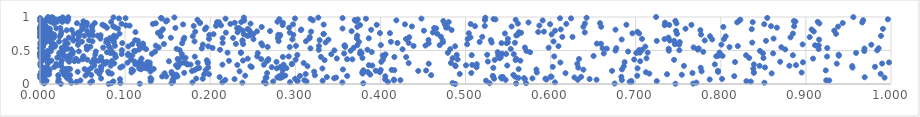
| Category | Series 0 |
|---|---|
| 0.4878804328560919 | 0.001 |
| 0.08073276438475993 | 0.002 |
| 0.024520375107620094 | 0.003 |
| 0.7467008120944755 | 0.004 |
| 0.11722900925854397 | 0.005 |
| 0.7674508384992096 | 0.006 |
| 0.6752529157554011 | 0.007 |
| 0.5594815407477001 | 0.008 |
| 0.26535349641097333 | 0.009 |
| 0.0048573380146806 | 0.01 |
| 0.3798312647377141 | 0.011 |
| 0.5282504182690033 | 0.012 |
| 0.5710814944261364 | 0.013 |
| 0.1545440385110519 | 0.014 |
| 0.4847732465467382 | 0.015 |
| 0.09444998300492234 | 0.016 |
| 0.08430114236085229 | 0.017 |
| 0.036811685665113475 | 0.018 |
| 0.8512460286920177 | 0.019 |
| 0.2378339751289925 | 0.02 |
| 0.7713538472379778 | 0.021 |
| 0.05912770461205603 | 0.022 |
| 0.17915505057889586 | 0.023 |
| 0.35533967566173225 | 0.024 |
| 0.6051288666323837 | 0.025 |
| 0.2142898749234011 | 0.026 |
| 0.29379831785421984 | 0.027 |
| 0.04321681422853025 | 0.028 |
| 0.2632830154315957 | 0.029 |
| 0.6950162819520104 | 0.03 |
| 0.04252047385372695 | 0.031 |
| 0.408837892637597 | 0.032 |
| 0.15646761964706865 | 0.033 |
| 0.6929178064437032 | 0.034 |
| 0.021331097201373203 | 0.035 |
| 0.8352700135851566 | 0.036 |
| 0.27395963208172985 | 0.037 |
| 0.3131909570694208 | 0.038 |
| 0.0862679016053936 | 0.039 |
| 0.13006355874069642 | 0.04 |
| 0.06121465551839461 | 0.041 |
| 0.8300943755709171 | 0.042 |
| 0.7247593880904459 | 0.043 |
| 0.30277974974433997 | 0.044 |
| 0.6948438279920354 | 0.045 |
| 0.004846995073066436 | 0.046 |
| 0.002621998886583417 | 0.047 |
| 0.3321628173878455 | 0.048 |
| 0.007754410727365538 | 0.049 |
| 0.5241294558206092 | 0.05 |
| 0.30195034415186683 | 0.051 |
| 0.0475264572983196 | 0.052 |
| 0.9274225627654002 | 0.053 |
| 0.005246357618146515 | 0.054 |
| 0.923861116569446 | 0.055 |
| 0.41596131428528604 | 0.056 |
| 0.31066149178171576 | 0.057 |
| 0.42348944540144506 | 0.058 |
| 0.6837534770686954 | 0.059 |
| 0.2176902512317171 | 0.06 |
| 0.03531344083209514 | 0.061 |
| 0.5471715728297489 | 0.062 |
| 0.6318762884274811 | 0.063 |
| 0.6539835170438418 | 0.064 |
| 0.15581519196866533 | 0.065 |
| 0.41582412523667245 | 0.066 |
| 0.5951834823529623 | 0.067 |
| 0.7869445026714389 | 0.068 |
| 0.40556056278413455 | 0.069 |
| 0.021906806795813222 | 0.07 |
| 0.1308218660485312 | 0.071 |
| 0.09397625475961295 | 0.072 |
| 0.22858739168592213 | 0.073 |
| 0.6458336717661135 | 0.074 |
| 0.5696911116029518 | 0.075 |
| 0.801482969613891 | 0.076 |
| 0.2997780643649713 | 0.077 |
| 0.19124046132683284 | 0.078 |
| 0.5336783961020007 | 0.079 |
| 0.5938597631287493 | 0.08 |
| 0.18356985160824893 | 0.081 |
| 0.5425075949592462 | 0.082 |
| 0.0717589911108597 | 0.083 |
| 0.5786409435452181 | 0.084 |
| 0.03216989785236622 | 0.085 |
| 0.3456796125363326 | 0.086 |
| 0.004840499050670466 | 0.087 |
| 0.5687619323102657 | 0.088 |
| 0.12978879707066976 | 0.089 |
| 0.2821670857440957 | 0.09 |
| 0.5620448655483232 | 0.091 |
| 0.265121880395184 | 0.092 |
| 0.00030277909072847403 | 0.093 |
| 0.2661861278499025 | 0.094 |
| 0.9924260365230058 | 0.095 |
| 0.3479821517756158 | 0.096 |
| 0.2788835404045434 | 0.097 |
| 0.6280132604290736 | 0.098 |
| 0.15837850628349803 | 0.099 |
| 0.5416673492873828 | 0.1 |
| 0.9690911224303287 | 0.101 |
| 0.28461401306692014 | 0.102 |
| 0.21112004652552252 | 0.103 |
| 0.33712095253899255 | 0.104 |
| 0.5439042644155626 | 0.105 |
| 0.6358284704066399 | 0.106 |
| 0.6831056416891739 | 0.107 |
| 0.6010519534140378 | 0.108 |
| 0.5583172252398778 | 0.109 |
| 0.6000127133095245 | 0.11 |
| 0.030590012816468386 | 0.111 |
| 0.14350465966794046 | 0.112 |
| 0.14842499886392138 | 0.113 |
| 0.1615426772578559 | 0.114 |
| 0.4057419509527594 | 0.115 |
| 0.28107096918776225 | 0.116 |
| 0.8158081772318846 | 0.117 |
| 0.5320411307256602 | 0.118 |
| 0.5323029949697392 | 0.119 |
| 0.3609641415388879 | 0.12 |
| 0.3055255005623854 | 0.121 |
| 0.006190611727082751 | 0.122 |
| 0.7018220829344053 | 0.123 |
| 0.24112139580812222 | 0.124 |
| 0.28820350021640295 | 0.125 |
| 0.05344917973416546 | 0.126 |
| 0.021603478124332588 | 0.127 |
| 0.0038223193811913058 | 0.128 |
| 0.00011299589376260692 | 0.129 |
| 0.02165129956009599 | 0.13 |
| 0.32303833684376726 | 0.131 |
| 0.45961917530682905 | 0.132 |
| 0.035412558361656264 | 0.133 |
| 0.06025116996658135 | 0.134 |
| 0.028532805774107068 | 0.135 |
| 0.5562409851575227 | 0.136 |
| 0.03221260247255145 | 0.137 |
| 0.754171800029363 | 0.138 |
| 0.00028714745434983084 | 0.139 |
| 0.1601450164175241 | 0.14 |
| 0.3880447917893416 | 0.141 |
| 0.010461693811720348 | 0.142 |
| 0.15588207477882193 | 0.143 |
| 0.003866084557679074 | 0.144 |
| 0.19283268731312433 | 0.145 |
| 0.7368077459962049 | 0.146 |
| 0.1985219693769392 | 0.147 |
| 0.2845539263029129 | 0.148 |
| 0.31221119297812255 | 0.149 |
| 0.4932635524502053 | 0.15 |
| 0.15534027847904738 | 0.151 |
| 0.9878257115096399 | 0.152 |
| 0.06971242871858695 | 0.153 |
| 0.08427142269704545 | 0.154 |
| 0.7160306101816701 | 0.155 |
| 0.3791022231225504 | 0.156 |
| 0.010228295964154272 | 0.157 |
| 0.8597426806381263 | 0.158 |
| 0.08118080807724261 | 0.159 |
| 0.14643736549496864 | 0.16 |
| 0.0032485407082466105 | 0.161 |
| 0.6175242453698286 | 0.162 |
| 0.2668742404216115 | 0.163 |
| 0.7667362577841988 | 0.164 |
| 0.5068025896575381 | 0.165 |
| 0.16944314847175573 | 0.166 |
| 0.0014290285657170298 | 0.167 |
| 0.05613651024632576 | 0.168 |
| 0.8388024418286827 | 0.169 |
| 0.8388497628330305 | 0.17 |
| 0.8949966076110618 | 0.171 |
| 0.5837864187066505 | 0.172 |
| 0.10749488751549689 | 0.173 |
| 0.378747323590484 | 0.174 |
| 0.004968766565573148 | 0.175 |
| 0.7119998873608324 | 0.176 |
| 0.3993585375321774 | 0.177 |
| 0.3852362630945356 | 0.178 |
| 0.15451569695854853 | 0.179 |
| 0.0014051420144248145 | 0.18 |
| 0.7967709519512499 | 0.181 |
| 0.044292480474079396 | 0.182 |
| 0.08009454783731007 | 0.183 |
| 0.00416016006646077 | 0.184 |
| 0.32211648286613465 | 0.185 |
| 0.010093721588487018 | 0.186 |
| 0.12984456984227402 | 0.187 |
| 0.3799310684924371 | 0.188 |
| 0.23451202038094537 | 0.189 |
| 0.7774495767478907 | 0.19 |
| 0.03108776077824677 | 0.191 |
| 0.06673229532734547 | 0.192 |
| 0.025991859205976284 | 0.193 |
| 0.17865473370587664 | 0.194 |
| 0.4444652216454424 | 0.195 |
| 0.6722009209051087 | 0.196 |
| 0.7966311860419103 | 0.197 |
| 0.39453371945009214 | 0.198 |
| 0.10957742556004342 | 0.199 |
| 0.071660261609627 | 0.2 |
| 0.45372156255193985 | 0.201 |
| 0.007284409817682827 | 0.202 |
| 0.9233439685878334 | 0.203 |
| 0.05644698423010802 | 0.204 |
| 0.3800227030086945 | 0.205 |
| 0.4164013454608789 | 0.206 |
| 0.19476915696729877 | 0.207 |
| 0.18156926764302353 | 0.208 |
| 0.28512100290619113 | 0.209 |
| 0.4004152312715871 | 0.21 |
| 0.4132256294324792 | 0.211 |
| 0.006211528615259479 | 0.212 |
| 0.005769867269270539 | 0.213 |
| 0.6385198957260038 | 0.214 |
| 0.011363778519053775 | 0.215 |
| 0.5833126981603439 | 0.216 |
| 0.35597461128823804 | 0.217 |
| 0.10769006445381778 | 0.218 |
| 0.6838799373254867 | 0.219 |
| 0.11882388542556604 | 0.22 |
| 0.13036381499371152 | 0.221 |
| 0.5624255369437771 | 0.222 |
| 0.05240727362098151 | 0.223 |
| 0.03527272625182964 | 0.224 |
| 0.1336462519848244 | 0.225 |
| 0.029767215886949503 | 0.226 |
| 0.03293518352890177 | 0.227 |
| 0.8381903989306807 | 0.228 |
| 0.18447936203957 | 0.229 |
| 0.12648962842428282 | 0.23 |
| 0.11655727256470541 | 0.231 |
| 0.33184463610818143 | 0.232 |
| 0.278239701719051 | 0.233 |
| 0.7021852303944293 | 0.234 |
| 0.059757354755039765 | 0.235 |
| 0.28960631321788205 | 0.236 |
| 0.0073229221389360935 | 0.237 |
| 0.12367115615976107 | 0.238 |
| 0.1870701765533602 | 0.239 |
| 0.07206025493486137 | 0.24 |
| 0.5326741199477586 | 0.241 |
| 0.7763954991317129 | 0.242 |
| 0.004801943345752876 | 0.243 |
| 0.6325120210121195 | 0.244 |
| 0.9547407891912948 | 0.245 |
| 0.09430132222157811 | 0.246 |
| 0.8519835129022563 | 0.247 |
| 0.19752033740732694 | 0.248 |
| 0.008640550065387893 | 0.249 |
| 0.5130037025259591 | 0.25 |
| 0.2723596399670112 | 0.251 |
| 0.16187908172722534 | 0.252 |
| 0.24877306919053543 | 0.253 |
| 0.016745185108791576 | 0.254 |
| 0.28233776433446667 | 0.255 |
| 0.6025260822936507 | 0.256 |
| 0.9811941835988178 | 0.257 |
| 0.0717364165851485 | 0.258 |
| 0.1618184920378862 | 0.259 |
| 0.11689116637345798 | 0.26 |
| 0.0010796117281438758 | 0.261 |
| 0.12487039257800384 | 0.262 |
| 0.09699971444412757 | 0.263 |
| 0.685993527501567 | 0.264 |
| 0.247255177119921 | 0.265 |
| 0.31430550055483264 | 0.266 |
| 0.48840041625442016 | 0.267 |
| 0.9544199155192055 | 0.268 |
| 0.024800576578820194 | 0.269 |
| 0.7566935407155277 | 0.27 |
| 0.8455029676268639 | 0.271 |
| 0.8805838022368809 | 0.272 |
| 0.08315581031238858 | 0.273 |
| 0.06381965518106965 | 0.274 |
| 0.3904826165721522 | 0.275 |
| 0.5490579299287539 | 0.276 |
| 0.4878232606534316 | 0.277 |
| 0.02036986213105455 | 0.278 |
| 0.5005746037642264 | 0.279 |
| 0.15986251021951017 | 0.28 |
| 0.3863996349930694 | 0.281 |
| 0.88841175047036 | 0.282 |
| 0.12891474629260508 | 0.283 |
| 0.23187875324346585 | 0.284 |
| 0.5078867484265639 | 0.285 |
| 0.00039206310688901083 | 0.286 |
| 0.2630546266447184 | 0.287 |
| 0.2862483399946667 | 0.288 |
| 0.21442490038701592 | 0.289 |
| 0.17692788528550152 | 0.29 |
| 0.17324285966814584 | 0.291 |
| 0.8388818286957135 | 0.292 |
| 0.7929511553334957 | 0.293 |
| 0.11201468798171484 | 0.294 |
| 0.5132745513252703 | 0.295 |
| 0.12068764813139325 | 0.296 |
| 0.2959516020633027 | 0.297 |
| 0.295952758340534 | 0.298 |
| 0.11558791722316475 | 0.299 |
| 0.01924900568183209 | 0.3 |
| 0.631354550919093 | 0.301 |
| 0.07648734417091542 | 0.302 |
| 0.456794812733079 | 0.303 |
| 0.936275713653441 | 0.304 |
| 0.989516137568601 | 0.305 |
| 0.16513957277058972 | 0.306 |
| 0.1720532785187269 | 0.307 |
| 0.08725939954992179 | 0.308 |
| 0.19703707036673246 | 0.309 |
| 0.024699237607075358 | 0.31 |
| 0.009206326219048487 | 0.311 |
| 0.4331974707807495 | 0.312 |
| 0.30987176318156645 | 0.313 |
| 0.4828387691123025 | 0.314 |
| 0.0006164706113904147 | 0.315 |
| 0.009432398059984056 | 0.316 |
| 0.10277117970582839 | 0.317 |
| 0.18535163965413745 | 0.318 |
| 0.1693282270465833 | 0.319 |
| 0.12895291597925018 | 0.32 |
| 0.6114743493023317 | 0.321 |
| 0.9976625430323695 | 0.322 |
| 0.06073991085714375 | 0.323 |
| 0.8965418151652575 | 0.324 |
| 0.12617789654068326 | 0.325 |
| 0.6869499682369447 | 0.326 |
| 0.19710900306605444 | 0.327 |
| 0.8167243831953318 | 0.328 |
| 0.07854927865583539 | 0.329 |
| 0.27789638334602296 | 0.33 |
| 0.4010562000259594 | 0.331 |
| 0.8698004617055751 | 0.332 |
| 0.03434817544324661 | 0.333 |
| 0.06435287961172466 | 0.334 |
| 0.5262322201733166 | 0.335 |
| 0.11109284093051447 | 0.336 |
| 0.2662786428825454 | 0.337 |
| 0.11749995737943608 | 0.338 |
| 0.15150252512682053 | 0.339 |
| 0.7053002547855568 | 0.34 |
| 0.040452703843514806 | 0.341 |
| 0.08430306228396622 | 0.342 |
| 0.0019007140563722846 | 0.343 |
| 0.07310545619634991 | 0.344 |
| 0.045099911874654 | 0.345 |
| 0.2220483023531025 | 0.346 |
| 0.06848988340176053 | 0.347 |
| 0.5645303740594104 | 0.348 |
| 0.013474003691693524 | 0.349 |
| 0.23856952775584955 | 0.35 |
| 0.025626557597972416 | 0.351 |
| 0.1627867163359205 | 0.352 |
| 0.009381549058196777 | 0.353 |
| 0.19606501107551233 | 0.354 |
| 0.2679305820518253 | 0.355 |
| 0.33439283066677267 | 0.356 |
| 0.5588290760652986 | 0.357 |
| 0.4027350165584904 | 0.358 |
| 0.534323876211148 | 0.359 |
| 0.0039172541118051435 | 0.36 |
| 0.7450711132193488 | 0.361 |
| 0.3003324744753328 | 0.362 |
| 0.05560099849194661 | 0.363 |
| 0.10696853276879185 | 0.364 |
| 0.03213514733392152 | 0.365 |
| 0.6981941443317247 | 0.366 |
| 0.49074175677678045 | 0.367 |
| 0.367052743308582 | 0.368 |
| 0.050251738940518514 | 0.369 |
| 0.3608638192510022 | 0.37 |
| 0.2600430841800198 | 0.371 |
| 0.26831337022341784 | 0.372 |
| 0.6333806335865365 | 0.373 |
| 0.06357652486058897 | 0.374 |
| 0.16169450244565126 | 0.375 |
| 0.5596676786614692 | 0.376 |
| 0.04227436361713509 | 0.377 |
| 0.24411703052452677 | 0.378 |
| 0.9084175652977917 | 0.379 |
| 0.11931100352704241 | 0.38 |
| 0.3488005029415835 | 0.381 |
| 0.0022570105534178387 | 0.382 |
| 0.7126748030478972 | 0.383 |
| 0.5401078838121054 | 0.384 |
| 0.48483687308101364 | 0.385 |
| 0.00212117494182966 | 0.386 |
| 0.8501495510373496 | 0.387 |
| 0.378889869516439 | 0.388 |
| 0.8333246017222306 | 0.389 |
| 0.001831437335832565 | 0.39 |
| 0.17106609380518625 | 0.391 |
| 0.05042434559835938 | 0.392 |
| 0.0004564766121756528 | 0.393 |
| 0.02026165646936537 | 0.394 |
| 0.005231301876030991 | 0.395 |
| 0.03567338724560051 | 0.396 |
| 0.16692305412570854 | 0.397 |
| 0.02162863038965665 | 0.398 |
| 0.5413750099484894 | 0.399 |
| 0.08898384897853658 | 0.4 |
| 0.07169828132175153 | 0.401 |
| 0.43028786247414147 | 0.402 |
| 0.4164080056394454 | 0.403 |
| 0.28538917307318934 | 0.404 |
| 0.33006845183676176 | 0.405 |
| 0.08869569646817746 | 0.406 |
| 0.4041208329824084 | 0.407 |
| 0.18190941362371318 | 0.408 |
| 0.03237277376619827 | 0.409 |
| 0.9248613575065089 | 0.41 |
| 0.29232044457187106 | 0.411 |
| 0.6042796171997077 | 0.412 |
| 0.25525140062431234 | 0.413 |
| 0.7946649772801395 | 0.414 |
| 0.05102084389973329 | 0.415 |
| 0.029333355324263545 | 0.416 |
| 0.5407643295131769 | 0.417 |
| 0.65047099883111 | 0.418 |
| 0.009339032555556164 | 0.419 |
| 0.8020435395127543 | 0.42 |
| 0.7969614054968295 | 0.421 |
| 0.9387033721263182 | 0.422 |
| 0.00014363689763233052 | 0.423 |
| 0.5384505617879908 | 0.424 |
| 0.4027004763623378 | 0.425 |
| 0.1085129525514328 | 0.426 |
| 0.10369551714385747 | 0.427 |
| 0.00821874739300025 | 0.428 |
| 0.8296831758417136 | 0.429 |
| 0.8847159404322933 | 0.43 |
| 0.5073123601049268 | 0.431 |
| 0.0005329192496341822 | 0.432 |
| 0.30238574877932034 | 0.433 |
| 0.026424466226492294 | 0.434 |
| 0.489741830451479 | 0.435 |
| 0.525485733103235 | 0.436 |
| 0.0007382716888134016 | 0.437 |
| 0.938480974057113 | 0.438 |
| 0.035588563190583705 | 0.439 |
| 0.08797312402383575 | 0.44 |
| 0.06498635957968327 | 0.441 |
| 0.4060001591295447 | 0.442 |
| 0.799259219884649 | 0.443 |
| 0.342271630575637 | 0.444 |
| 0.5567236679169169 | 0.445 |
| 0.16666211391573665 | 0.446 |
| 0.09603530891103843 | 0.447 |
| 0.5477349605522043 | 0.448 |
| 0.10365759022729 | 0.449 |
| 0.13151724471789794 | 0.45 |
| 0.038357999606142765 | 0.451 |
| 0.5429251719787614 | 0.452 |
| 0.37593868515022627 | 0.453 |
| 2.4098061986341503e-06 | 0.454 |
| 0.3573918234979182 | 0.455 |
| 0.6624595822764178 | 0.456 |
| 0.8614622608425339 | 0.457 |
| 0.8494897665362235 | 0.458 |
| 0.08279309213828005 | 0.459 |
| 0.37791722615887363 | 0.46 |
| 0.25588737520752214 | 0.461 |
| 0.022568669901088065 | 0.462 |
| 0.700691714952639 | 0.463 |
| 0.9589781801218543 | 0.464 |
| 0.236055197894816 | 0.465 |
| 0.4792446697239987 | 0.466 |
| 0.7048587573122125 | 0.467 |
| 0.22038232492455234 | 0.468 |
| 0.7141076526409812 | 0.469 |
| 0.7984547033432992 | 0.47 |
| 0.23602148621525765 | 0.471 |
| 0.004597533648327746 | 0.472 |
| 0.07877538966815124 | 0.473 |
| 0.5759527168761229 | 0.474 |
| 0.5377913773107293 | 0.475 |
| 0.08476609244911831 | 0.476 |
| 0.38983507285356916 | 0.477 |
| 0.0029230883708738727 | 0.478 |
| 0.0004333315736467429 | 0.479 |
| 0.7793814942518776 | 0.48 |
| 0.03860489543802216 | 0.481 |
| 0.007748547914687214 | 0.482 |
| 0.1352629750385829 | 0.483 |
| 0.6910511441616597 | 0.484 |
| 0.06561992038278025 | 0.485 |
| 0.37662313655383994 | 0.486 |
| 0.04570635480848414 | 0.487 |
| 0.012700289491648064 | 0.488 |
| 0.11183628119009892 | 0.489 |
| 0.010456718949714375 | 0.49 |
| 0.00869478520166727 | 0.491 |
| 0.9686153158919509 | 0.492 |
| 0.5715310095706708 | 0.493 |
| 0.8460033478641477 | 0.494 |
| 0.11076974293604613 | 0.495 |
| 0.3650589305662053 | 0.496 |
| 0.7389592578263637 | 0.497 |
| 0.6762585400855802 | 0.498 |
| 0.0015937227833062511 | 0.499 |
| 0.02623342205102726 | 0.5 |
| 0.02806790502803318 | 0.501 |
| 0.3459360784512988 | 0.502 |
| 0.9837478196222861 | 0.503 |
| 0.7512971239097903 | 0.504 |
| 0.09618131585489309 | 0.505 |
| 0.164107009251769 | 0.506 |
| 0.7040947463241966 | 0.507 |
| 0.028043252773303853 | 0.508 |
| 0.7075420302592448 | 0.509 |
| 0.32757106025504923 | 0.51 |
| 0.21155765686984115 | 0.511 |
| 0.38476929108124963 | 0.512 |
| 0.7729021583531185 | 0.513 |
| 0.11629756603331938 | 0.514 |
| 0.05522735563393523 | 0.515 |
| 0.8757231208275742 | 0.516 |
| 0.03661422824569572 | 0.517 |
| 0.4260011260660146 | 0.518 |
| 0.08300243674266906 | 0.519 |
| 0.482013200580466 | 0.52 |
| 0.12464335639806035 | 0.521 |
| 0.9149372780517534 | 0.522 |
| 0.7731291080869948 | 0.523 |
| 0.5532001215118635 | 0.524 |
| 0.16057617068201335 | 0.525 |
| 0.03204101889853816 | 0.526 |
| 0.738768999889407 | 0.527 |
| 0.6660224123760147 | 0.528 |
| 0.9688174390859076 | 0.529 |
| 0.1900604616465408 | 0.53 |
| 0.7740373015540072 | 0.531 |
| 0.3177968124569593 | 0.532 |
| 0.6610374674296705 | 0.533 |
| 0.9855258225265562 | 0.534 |
| 0.6772321335186212 | 0.535 |
| 7.371401266291354e-06 | 0.536 |
| 0.9250649942988506 | 0.537 |
| 0.025493169054601087 | 0.538 |
| 0.2027336994723029 | 0.539 |
| 0.3685373505789188 | 0.54 |
| 0.05524181560820327 | 0.541 |
| 0.5976697226559884 | 0.542 |
| 0.07425287024111205 | 0.543 |
| 0.5697715224181333 | 0.544 |
| 0.1395561775018042 | 0.545 |
| 0.7680193929215134 | 0.546 |
| 0.015027744208362065 | 0.547 |
| 0.1210828006815653 | 0.548 |
| 0.8711415659903715 | 0.549 |
| 0.013242202384165354 | 0.55 |
| 0.8102184639397074 | 0.551 |
| 0.2934911251809205 | 0.552 |
| 0.26755230411073594 | 0.553 |
| 0.35863172084027367 | 0.554 |
| 0.0024527080881181144 | 0.555 |
| 0.0036912417120995938 | 0.556 |
| 0.0591805308059895 | 0.557 |
| 0.7112877790438461 | 0.558 |
| 0.017293941930103297 | 0.559 |
| 0.05481865516037519 | 0.56 |
| 0.10374494207605388 | 0.561 |
| 0.19766832406738577 | 0.562 |
| 0.48778156722708405 | 0.563 |
| 0.6092573327527233 | 0.564 |
| 0.08084233611683742 | 0.565 |
| 0.819990346356974 | 0.566 |
| 0.3278094107500242 | 0.567 |
| 0.4389408881098315 | 0.568 |
| 0.300808026557572 | 0.569 |
| 0.08809323181453887 | 0.57 |
| 0.35786562825756707 | 0.571 |
| 0.13612282919534713 | 0.572 |
| 0.017830396459576944 | 0.573 |
| 0.45299082127765616 | 0.574 |
| 0.26145648283696465 | 0.575 |
| 0.9150815391825827 | 0.576 |
| 0.35800032025119155 | 0.577 |
| 0.9107338502784176 | 0.578 |
| 0.46963453274597444 | 0.579 |
| 0.37298517885832855 | 0.58 |
| 0.40051822392567493 | 0.581 |
| 0.1211163341796962 | 0.582 |
| 0.0023257340241041604 | 0.583 |
| 0.04461664134406392 | 0.584 |
| 0.11636981788586791 | 0.585 |
| 0.9768533219072987 | 0.586 |
| 0.029503200640442092 | 0.587 |
| 0.8006531963922889 | 0.588 |
| 0.19131282698768123 | 0.589 |
| 0.7509814237233287 | 0.59 |
| 0.8961374071170638 | 0.591 |
| 0.00041705295498442 | 0.592 |
| 0.5018993823877451 | 0.593 |
| 0.7460709715756778 | 0.594 |
| 0.10842859102141192 | 0.595 |
| 0.238701913065396 | 0.596 |
| 0.14560211341724255 | 0.597 |
| 0.016077286143521184 | 0.598 |
| 0.23023097526991068 | 0.599 |
| 0.013998506595596628 | 0.6 |
| 0.6591576691533734 | 0.601 |
| 0.003919560484912233 | 0.602 |
| 0.6543649222776524 | 0.603 |
| 0.12083992440431053 | 0.604 |
| 0.03256715964300869 | 0.605 |
| 0.45672774658020676 | 0.606 |
| 0.26005381288165946 | 0.607 |
| 0.16703390481519736 | 0.608 |
| 0.5482534066396328 | 0.609 |
| 0.5423083481471368 | 0.61 |
| 0.09668418830943044 | 0.611 |
| 0.4199820699502227 | 0.612 |
| 0.43325151079521806 | 0.613 |
| 0.21460493996714744 | 0.614 |
| 0.5581022605572347 | 0.615 |
| 0.006113712649403389 | 0.616 |
| 0.0005356273157260998 | 0.617 |
| 0.8369761177409459 | 0.618 |
| 0.5307739304668345 | 0.619 |
| 0.33561998130695403 | 0.62 |
| 0.5498274070342852 | 0.621 |
| 0.07783920637466996 | 0.622 |
| 0.0798047137845491 | 0.623 |
| 0.47358051186685235 | 0.624 |
| 0.08676814484997124 | 0.625 |
| 0.7517827667487094 | 0.626 |
| 0.0011147831675271905 | 0.627 |
| 0.5166185225667266 | 0.628 |
| 0.3747736296470871 | 0.629 |
| 0.41232322526446175 | 0.63 |
| 0.0492952593125873 | 0.631 |
| 0.0018360701360079276 | 0.632 |
| 0.02246175730897354 | 0.633 |
| 0.011748690438662944 | 0.634 |
| 0.6034918024757333 | 0.635 |
| 0.18157214978538172 | 0.636 |
| 0.06171389221127793 | 0.637 |
| 0.3124778126449233 | 0.638 |
| 0.006925518472146509 | 0.639 |
| 0.28038743320089204 | 0.64 |
| 0.02950421622828171 | 0.641 |
| 0.2379053513141916 | 0.642 |
| 0.7247460676717148 | 0.643 |
| 0.8531189054681171 | 0.644 |
| 0.7451359380354635 | 0.645 |
| 0.11497274886129365 | 0.646 |
| 0.03932678979055069 | 0.647 |
| 0.009862827108182703 | 0.648 |
| 0.7400743331451095 | 0.649 |
| 0.7811293809569402 | 0.65 |
| 0.47309627830593876 | 0.651 |
| 0.2380129227964317 | 0.652 |
| 0.05765902241948674 | 0.653 |
| 0.11180375852923959 | 0.654 |
| 0.3285826588140346 | 0.655 |
| 0.5297442667768225 | 0.656 |
| 0.07825559378831967 | 0.657 |
| 0.45648584323000857 | 0.658 |
| 0.08613283642687514 | 0.659 |
| 0.04401107244079886 | 0.66 |
| 0.16859731235729541 | 0.661 |
| 0.3389825301897626 | 0.662 |
| 0.9155108298637797 | 0.663 |
| 0.683532070744336 | 0.664 |
| 0.789842654282485 | 0.665 |
| 0.29653505312089584 | 0.666 |
| 0.0868132208523343 | 0.667 |
| 0.25088611645595105 | 0.668 |
| 0.8037039032913663 | 0.669 |
| 0.7338942835248554 | 0.67 |
| 0.5025555452530444 | 0.671 |
| 0.43010151228484456 | 0.672 |
| 0.7074133516524248 | 0.673 |
| 0.19859621865844837 | 0.674 |
| 0.5498382164626754 | 0.675 |
| 0.038026464149268135 | 0.676 |
| 0.07101910002681866 | 0.677 |
| 0.862012803542245 | 0.678 |
| 0.005998125321160136 | 0.679 |
| 0.3164959401120942 | 0.68 |
| 0.014113447773035387 | 0.681 |
| 0.3863747160317602 | 0.682 |
| 0.3722580053513747 | 0.683 |
| 0.21456963651879354 | 0.684 |
| 0.08209429266820199 | 0.685 |
| 0.27953569398326483 | 0.686 |
| 0.2268984144802883 | 0.687 |
| 0.010392180360359717 | 0.688 |
| 0.01582441977932965 | 0.689 |
| 0.15375238671486713 | 0.69 |
| 0.16958813896738145 | 0.691 |
| 0.03390975652210996 | 0.692 |
| 0.7384440431652514 | 0.693 |
| 0.007706240131594189 | 0.694 |
| 0.5058536876814933 | 0.695 |
| 0.8819068314147813 | 0.696 |
| 0.016373711616020754 | 0.697 |
| 0.4339221289650943 | 0.698 |
| 2.370103429860438e-05 | 0.699 |
| 0.9044615895979488 | 0.7 |
| 0.3169503664093007 | 0.701 |
| 0.6257533471044128 | 0.702 |
| 0.6137533870231593 | 0.703 |
| 0.5196943376162774 | 0.704 |
| 0.08951508909810066 | 0.705 |
| 0.4710712736160111 | 0.706 |
| 0.0008673485842010275 | 0.707 |
| 0.04567454354876993 | 0.708 |
| 0.023138250159842513 | 0.709 |
| 0.2815065182257501 | 0.71 |
| 0.8057171489230155 | 0.711 |
| 0.14210108506324048 | 0.712 |
| 0.7873595105357852 | 0.713 |
| 0.17955594152590862 | 0.714 |
| 0.004720424837466599 | 0.715 |
| 0.0060269439541850035 | 0.716 |
| 0.24372247527434004 | 0.717 |
| 0.9882319881153232 | 0.718 |
| 2.5961232088254276e-05 | 0.719 |
| 0.05230053365123733 | 0.72 |
| 0.08689107090602854 | 0.721 |
| 0.06745050540154411 | 0.722 |
| 0.3727815029318219 | 0.723 |
| 0.5596977360619596 | 0.724 |
| 0.24594594140116946 | 0.725 |
| 0.062041848766914764 | 0.726 |
| 0.004186563472255715 | 0.727 |
| 0.0711833996852493 | 0.728 |
| 0.010990006743802426 | 0.729 |
| 0.5605360854104642 | 0.73 |
| 0.282294085064226 | 0.731 |
| 0.19888194270069895 | 0.732 |
| 0.05800448915508257 | 0.733 |
| 0.29768341209784993 | 0.734 |
| 0.279981840063777 | 0.735 |
| 0.24684630228209545 | 0.736 |
| 0.01664732441223427 | 0.737 |
| 0.7767853943772486 | 0.738 |
| 0.5611547421838529 | 0.739 |
| 0.024595065318149967 | 0.74 |
| 0.601237325909071 | 0.741 |
| 0.25056977372293787 | 0.742 |
| 0.23957532931754033 | 0.743 |
| 0.20394031928398276 | 0.744 |
| 0.03982526066259559 | 0.745 |
| 0.33345490936137506 | 0.746 |
| 0.33314606050854373 | 0.747 |
| 0.7485362511584908 | 0.748 |
| 0.9353745388266547 | 0.749 |
| 0.4668325794105194 | 0.75 |
| 0.014330532403453344 | 0.751 |
| 0.09345047834866259 | 0.752 |
| 0.8847815993425467 | 0.753 |
| 0.5462721678480458 | 0.754 |
| 0.7041062223620623 | 0.755 |
| 0.6961315462023213 | 0.756 |
| 0.046630384139075755 | 0.757 |
| 0.5038833011309061 | 0.758 |
| 0.4112235841352728 | 0.759 |
| 0.3994732934318742 | 0.76 |
| 1.1975445482629479e-05 | 0.761 |
| 0.00299645847067518 | 0.762 |
| 0.13858039711570855 | 0.763 |
| 0.5653031242961476 | 0.764 |
| 0.04475339426198543 | 0.765 |
| 0.21840120686252879 | 0.766 |
| 0.2935494743706253 | 0.767 |
| 0.04551263737313591 | 0.768 |
| 0.4616777603677991 | 0.769 |
| 0.6401852552151067 | 0.77 |
| 0.24758034445700255 | 0.771 |
| 0.23217543747356403 | 0.772 |
| 0.5627261717448159 | 0.773 |
| 0.11216532631842088 | 0.774 |
| 0.006318839411220468 | 0.775 |
| 0.5853996154528224 | 0.776 |
| 0.025044935549641417 | 0.777 |
| 0.0042214898317282324 | 0.778 |
| 0.7020352646087704 | 0.779 |
| 0.18243006160660707 | 0.78 |
| 0.3184900037607264 | 0.781 |
| 0.5921566825133087 | 0.782 |
| 0.0067322702275076024 | 0.783 |
| 0.9092614663551798 | 0.784 |
| 0.25493941484355953 | 0.785 |
| 0.007877772819158602 | 0.786 |
| 0.14213860694816202 | 0.787 |
| 0.36617466438418556 | 0.788 |
| 0.055639237988095974 | 0.789 |
| 0.2703407028046997 | 0.79 |
| 0.002022754610950884 | 0.791 |
| 0.7473863401225482 | 0.792 |
| 0.06167233054047558 | 0.793 |
| 0.010656296301088577 | 0.794 |
| 0.6052615674604661 | 0.795 |
| 0.451116916558055 | 0.796 |
| 0.9333400513498165 | 0.797 |
| 0.23816504496934487 | 0.798 |
| 0.0017827604003611266 | 0.799 |
| 1.0961176985320753e-05 | 0.8 |
| 0.011418931737032376 | 0.801 |
| 0.03131444751780394 | 0.802 |
| 0.7760190533144329 | 0.803 |
| 0.0015317209456954816 | 0.804 |
| 0.30651957724191287 | 0.805 |
| 0.48366223886396725 | 0.806 |
| 0.037332001138171526 | 0.807 |
| 0.005765454141668428 | 0.808 |
| 0.3891203068720832 | 0.809 |
| 0.24531552346637353 | 0.81 |
| 0.6762432075594872 | 0.811 |
| 0.3070796261830484 | 0.812 |
| 0.90677057129569 | 0.813 |
| 0.002787348339112771 | 0.814 |
| 0.6119288286984893 | 0.815 |
| 0.19382186383976227 | 0.816 |
| 0.14443727500481474 | 0.817 |
| 0.8363475041342501 | 0.818 |
| 0.010278192013203466 | 0.819 |
| 0.2439771882143188 | 0.82 |
| 0.05010152713915678 | 0.821 |
| 1.1252430272735727e-05 | 0.822 |
| 0.9905301154179929 | 0.823 |
| 0.04954823682228272 | 0.824 |
| 0.75853623890748 | 0.825 |
| 0.09163305480469153 | 0.826 |
| 0.011532002924242123 | 0.827 |
| 0.35548707634277465 | 0.828 |
| 0.46556514357809514 | 0.829 |
| 0.019267109219278367 | 0.83 |
| 0.0014158989810847827 | 0.831 |
| 0.0008532434106692857 | 0.832 |
| 0.23409400165071656 | 0.833 |
| 0.23159122066726623 | 0.834 |
| 0.023887094444647178 | 0.835 |
| 0.46324134190451083 | 0.836 |
| 0.15912005900423973 | 0.837 |
| 0.00031321390160112304 | 0.838 |
| 0.07866125008162807 | 0.839 |
| 0.2926926665730875 | 0.84 |
| 0.8659343162878067 | 0.841 |
| 0.477195303991521 | 0.842 |
| 0.19542106812855092 | 0.843 |
| 0.08830210180930999 | 0.844 |
| 0.47905627885429725 | 0.845 |
| 0.004031910302740731 | 0.846 |
| 0.061152550542056594 | 0.847 |
| 6.19635857646262e-05 | 0.848 |
| 0.004052316420632422 | 0.849 |
| 0.0055974495997513736 | 0.85 |
| 0.2605201405661364 | 0.851 |
| 0.8029761620188648 | 0.852 |
| 0.3728971055889323 | 0.853 |
| 0.6594431033124832 | 0.854 |
| 0.638510702380899 | 0.855 |
| 0.00275879497340528 | 0.856 |
| 0.9378382664330006 | 0.857 |
| 0.5541554870853271 | 0.858 |
| 0.43702967994967806 | 0.859 |
| 0.00712348431142812 | 0.86 |
| 0.08604996087312192 | 0.861 |
| 0.8862030824899516 | 0.862 |
| 0.5111973716240348 | 0.863 |
| 0.8590362216294881 | 0.864 |
| 0.07626335984039903 | 0.865 |
| 0.5226702546125471 | 0.866 |
| 0.18063813547573906 | 0.867 |
| 0.2068376622882654 | 0.868 |
| 0.061326396782353944 | 0.869 |
| 0.05461815005969219 | 0.87 |
| 0.10538080837162742 | 0.871 |
| 0.5867868542364147 | 0.872 |
| 0.07541428085240191 | 0.873 |
| 0.049340729015416154 | 0.874 |
| 0.10101878641925209 | 0.875 |
| 0.21271068433277251 | 0.876 |
| 0.7340818120982032 | 0.877 |
| 0.0010173836368632064 | 0.878 |
| 0.28513780234803854 | 0.879 |
| 0.3760567141188938 | 0.88 |
| 0.7394053540814078 | 0.881 |
| 0.7654633798236025 | 0.882 |
| 0.3956517998762936 | 0.883 |
| 0.6890709337314712 | 0.884 |
| 0.07331727060697793 | 0.885 |
| 0.0015735538471409744 | 0.886 |
| 0.33336411114804054 | 0.887 |
| 0.005413546167794674 | 0.888 |
| 0.1681700169838073 | 0.889 |
| 0.2972516090037015 | 0.89 |
| 0.4288536613522611 | 0.891 |
| 0.599398558170138 | 0.892 |
| 0.8510184591787161 | 0.893 |
| 0.4755151058711453 | 0.894 |
| 0.5060616802812977 | 0.895 |
| 0.13267289233591484 | 0.896 |
| 0.22370309921777348 | 0.897 |
| 0.6184551811530613 | 0.898 |
| 0.0958083673760562 | 0.899 |
| 0.016607147977773885 | 0.9 |
| 0.2473860482081092 | 0.901 |
| 0.5616248326229175 | 0.902 |
| 0.6403289265020833 | 0.903 |
| 0.9158534819406925 | 0.904 |
| 0.7479160858722999 | 0.905 |
| 0.13605550496215865 | 0.906 |
| 0.043451282160890975 | 0.907 |
| 0.6580966740027147 | 0.908 |
| 0.06439381153784544 | 0.909 |
| 0.9432577892257746 | 0.91 |
| 0.18809143639677925 | 0.911 |
| 0.05504188880240484 | 0.912 |
| 0.285443075767317 | 0.913 |
| 0.2288306106805589 | 0.914 |
| 0.7344469882550924 | 0.915 |
| 0.05209410175443332 | 0.916 |
| 0.18759722697910433 | 0.917 |
| 0.574023133802088 | 0.918 |
| 0.9662112591978471 | 0.919 |
| 0.8192434789744814 | 0.92 |
| 0.2105372982774325 | 0.921 |
| 0.20796111043365131 | 0.922 |
| 0.8375223716527649 | 0.923 |
| 0.4802799722026193 | 0.924 |
| 0.23645288462866457 | 0.925 |
| 0.08358924579896922 | 0.926 |
| 0.026197885966897518 | 0.927 |
| 0.9138875196431308 | 0.928 |
| 0.2790540263904552 | 0.929 |
| 0.01227538601671128 | 0.93 |
| 0.020450817408499435 | 0.931 |
| 0.8876870887652805 | 0.932 |
| 0.1481466632886413 | 0.933 |
| 0.03215171688412866 | 0.934 |
| 0.005695284555015937 | 0.935 |
| 0.05100190450730194 | 0.936 |
| 0.3715233716071376 | 0.937 |
| 0.013402186750138123 | 0.938 |
| 0.8858088116523527 | 0.939 |
| 0.47394163130823314 | 0.94 |
| 0.0005087417042294879 | 0.941 |
| 0.7466210658028585 | 0.942 |
| 0.00022881070835759304 | 0.943 |
| 0.007606294897827151 | 0.944 |
| 0.001913664231880332 | 0.945 |
| 0.8217952989032377 | 0.946 |
| 0.24005899012948353 | 0.947 |
| 0.14941376024443825 | 0.948 |
| 0.5906784745578416 | 0.949 |
| 0.41876029499092576 | 0.95 |
| 0.32061944171721307 | 0.951 |
| 0.9672866245376315 | 0.952 |
| 0.0064011796030846 | 0.953 |
| 0.3697998880964792 | 0.954 |
| 0.5228094620550144 | 0.955 |
| 0.010630485971983248 | 0.956 |
| 0.02859593542435127 | 0.957 |
| 0.558942367345841 | 0.958 |
| 0.18498555874883452 | 0.959 |
| 0.8229417066888135 | 0.96 |
| 0.0194367376208312 | 0.961 |
| 0.03312422479086045 | 0.962 |
| 0.37341791339595876 | 0.963 |
| 0.5352481724604012 | 0.964 |
| 0.9962602342629351 | 0.965 |
| 0.023104565965956163 | 0.966 |
| 0.023301561956152305 | 0.967 |
| 0.28122345807498494 | 0.968 |
| 0.5329630818765334 | 0.969 |
| 0.010539075477820384 | 0.97 |
| 0.012058894905700186 | 0.971 |
| 0.015618505449460175 | 0.972 |
| 0.31788894758325104 | 0.973 |
| 0.38300906299326076 | 0.974 |
| 0.21801717766495335 | 0.975 |
| 0.44822366474287584 | 0.976 |
| 0.1430375218014389 | 0.977 |
| 0.2996541464049285 | 0.978 |
| 0.09284874965243085 | 0.979 |
| 0.624037759909373 | 0.98 |
| 0.611093867572376 | 0.981 |
| 0.10048202958678949 | 0.982 |
| 8.697124746219699e-05 | 0.983 |
| 0.35552621407000573 | 0.984 |
| 0.14226225659510908 | 0.985 |
| 0.8546032275442242 | 0.986 |
| 0.015435260090927464 | 0.987 |
| 0.009073375403786173 | 0.988 |
| 0.6422733996537194 | 0.989 |
| 0.5233059040229617 | 0.99 |
| 0.32704119547444 | 0.991 |
| 0.23955537031896476 | 0.992 |
| 0.15792387982362568 | 0.993 |
| 0.0863678478533981 | 0.994 |
| 0.026618342794697884 | 0.995 |
| 0.03318964322533565 | 0.996 |
| 0.013956625322822592 | 0.997 |
| 0.9557468827381225 | 0.998 |
| 0.009466033079332787 | 0.999 |
| 0.723959567651597 | 1 |